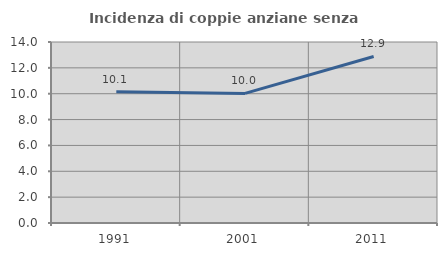
| Category | Incidenza di coppie anziane senza figli  |
|---|---|
| 1991.0 | 10.145 |
| 2001.0 | 10.026 |
| 2011.0 | 12.883 |